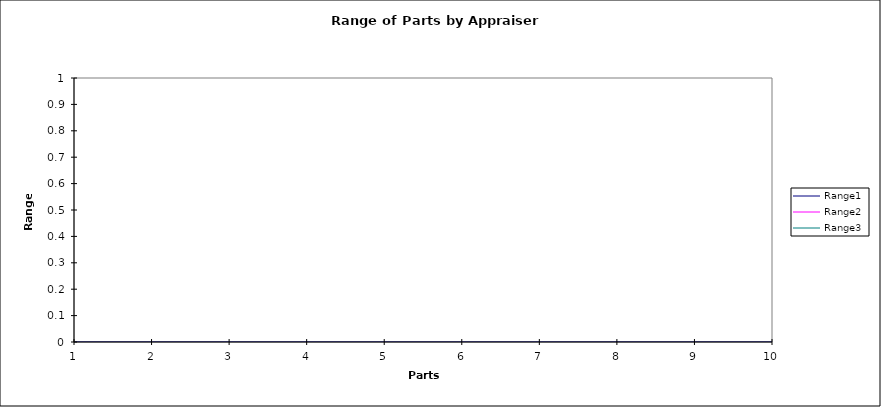
| Category | Range1 | Range2 | Range3 | UCL | Rave |
|---|---|---|---|---|---|
| 1 | 0 | 0 | 0 |  |  |
| 2 | 0 | 0 | 0 |  |  |
| 3 | 0 | 0 | 0 |  |  |
| 4 | 0 | 0 | 0 |  |  |
| 5 | 0 | 0 | 0 |  |  |
| 6 | 0 | 0 | 0 |  |  |
| 7 | 0 | 0 | 0 |  |  |
| 8 | 0 | 0 | 0 |  |  |
| 9 | 0 | 0 | 0 |  |  |
| 10 | 0 | 0 | 0 |  |  |